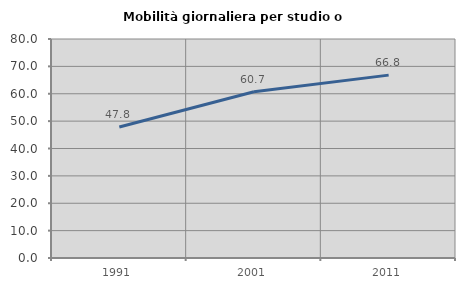
| Category | Mobilità giornaliera per studio o lavoro |
|---|---|
| 1991.0 | 47.829 |
| 2001.0 | 60.729 |
| 2011.0 | 66.806 |